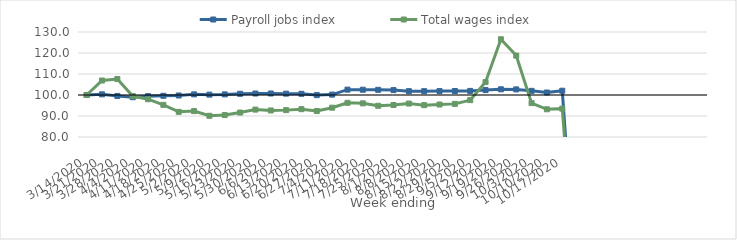
| Category | Payroll jobs index | Total wages index |
|---|---|---|
| 14/03/2020 | 100 | 100 |
| 21/03/2020 | 100.306 | 106.904 |
| 28/03/2020 | 99.549 | 107.607 |
| 04/04/2020 | 98.949 | 99.507 |
| 11/04/2020 | 99.445 | 97.996 |
| 18/04/2020 | 99.623 | 95.305 |
| 25/04/2020 | 99.771 | 91.973 |
| 02/05/2020 | 100.301 | 92.335 |
| 09/05/2020 | 100.176 | 90.098 |
| 16/05/2020 | 100.29 | 90.442 |
| 23/05/2020 | 100.574 | 91.641 |
| 30/05/2020 | 100.708 | 93.048 |
| 06/06/2020 | 100.716 | 92.642 |
| 13/06/2020 | 100.644 | 92.797 |
| 20/06/2020 | 100.572 | 93.244 |
| 27/06/2020 | 99.944 | 92.372 |
| 04/07/2020 | 100.191 | 93.958 |
| 11/07/2020 | 102.557 | 96.271 |
| 18/07/2020 | 102.509 | 96.024 |
| 25/07/2020 | 102.466 | 94.869 |
| 01/08/2020 | 102.329 | 95.228 |
| 08/08/2020 | 101.826 | 95.929 |
| 15/08/2020 | 101.823 | 95.168 |
| 22/08/2020 | 101.872 | 95.476 |
| 29/08/2020 | 101.911 | 95.773 |
| 05/09/2020 | 101.947 | 97.564 |
| 12/09/2020 | 102.331 | 106.158 |
| 19/09/2020 | 102.704 | 126.537 |
| 26/09/2020 | 102.669 | 118.768 |
| 03/10/2020 | 101.973 | 96.14 |
| 10/10/2020 | 101.188 | 93.196 |
| 17/10/2020 | 102.033 | 93.509 |